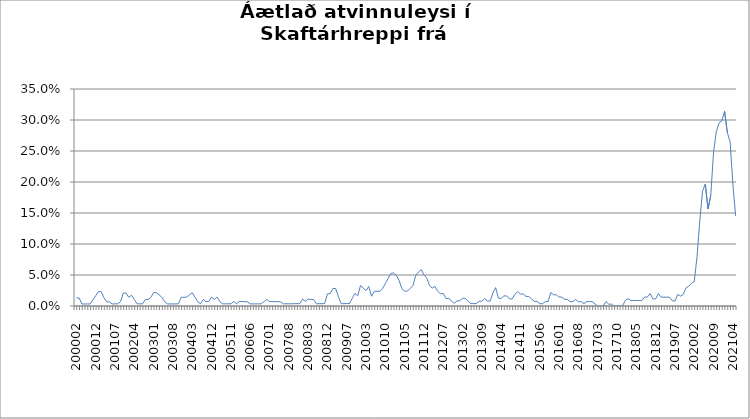
| Category | Series 0 |
|---|---|
| 200002 | 0.013 |
| 200003 | 0.013 |
| 200004 | 0.003 |
| 200005 | 0.003 |
| 200006 | 0.003 |
| 200007 | 0.003 |
| 200011 | 0.01 |
| 200012 | 0.017 |
| 200101 | 0.023 |
| 200102 | 0.023 |
| 200103 | 0.013 |
| 200104 | 0.007 |
| 200105 | 0.007 |
| 200106 | 0.003 |
| 200107 | 0.003 |
| 200108 | 0.003 |
| 200111 | 0.007 |
| 200112 | 0.021 |
| 200201 | 0.021 |
| 200202 | 0.014 |
| 200203 | 0.017 |
| 200204 | 0.01 |
| 200205 | 0.003 |
| 200206 | 0.003 |
| 200207 | 0.003 |
| 200210 | 0.01 |
| 200211 | 0.01 |
| 200212 | 0.014 |
| 200301 | 0.022 |
| 200302 | 0.022 |
| 200303 | 0.018 |
| 200304 | 0.014 |
| 200305 | 0.007 |
| 200306 | 0.003 |
| 200307 | 0.003 |
| 200308 | 0.003 |
| 200309 | 0.003 |
| 200310 | 0.004 |
| 200311 | 0.014 |
| 200312 | 0.014 |
| 200401 | 0.014 |
| 200402 | 0.018 |
| 200403 | 0.022 |
| 200404 | 0.014 |
| 200405 | 0.007 |
| 200406 | 0.004 |
| 200407 | 0.011 |
| 200408 | 0.007 |
| 200411 | 0.007 |
| 200412 | 0.014 |
| 200501 | 0.011 |
| 200502 | 0.014 |
| 200503 | 0.007 |
| 200504 | 0.004 |
| 200505 | 0.004 |
| 200510 | 0.004 |
| 200511 | 0.004 |
| 200512 | 0.007 |
| 200601 | 0.004 |
| 200602 | 0.007 |
| 200603 | 0.007 |
| 200604 | 0.007 |
| 200605 | 0.007 |
| 200606 | 0.003 |
| 200607 | 0.003 |
| 200608 | 0.003 |
| 200609 | 0.003 |
| 200610 | 0.004 |
| 200611 | 0.007 |
| 200612 | 0.011 |
| 200701 | 0.007 |
| 200702 | 0.007 |
| 200703 | 0.007 |
| 200704 | 0.007 |
| 200705 | 0.007 |
| 200706 | 0.003 |
| 200707 | 0.004 |
| 200708 | 0.004 |
| 200709 | 0.004 |
| 200710 | 0.004 |
| 200711 | 0.004 |
| 200712 | 0.004 |
| 200801 | 0.011 |
| 200802 | 0.007 |
| 200803 | 0.011 |
| 200804 | 0.011 |
| 200805 | 0.011 |
| 200806 | 0.004 |
| 200807 | 0.004 |
| 200808 | 0.004 |
| 200811 | 0.004 |
| 200812 | 0.019 |
| 200901 | 0.02 |
| 200902 | 0.028 |
| 200903 | 0.028 |
| 200904 | 0.015 |
| 200905 | 0.004 |
| 200906 | 0.004 |
| 200907 | 0.004 |
| 200908 | 0.004 |
| 200910 | 0.012 |
| 200911 | 0.02 |
| 200912 | 0.016 |
| 201001 | 0.033 |
| 201002 | 0.029 |
| 201003 | 0.025 |
| 201004 | 0.031 |
| 201005 | 0.016 |
| 201006 | 0.024 |
| 201007 | 0.024 |
| 201008 | 0.024 |
| 201009 | 0.028 |
| 201010 | 0.036 |
| 201011 | 0.044 |
| 201012 | 0.052 |
| 201101 | 0.053 |
| 201102 | 0.049 |
| 201103 | 0.041 |
| 201104 | 0.028 |
| 201105 | 0.024 |
| 201106 | 0.024 |
| 201107 | 0.028 |
| 201108 | 0.033 |
| 201109 | 0.049 |
| 201110 | 0.055 |
| 201111 | 0.059 |
| 201112 | 0.05 |
| 201201 | 0.045 |
| 201202 | 0.033 |
| 201203 | 0.029 |
| 201204 | 0.032 |
| 201205 | 0.024 |
| 201206 | 0.02 |
| 201207 | 0.02 |
| 201208 | 0.012 |
| 201209 | 0.012 |
| 201210 | 0.008 |
| 201211 | 0.004 |
| 201212 | 0.008 |
| 201301 | 0.008 |
| 201302 | 0.012 |
| 201303 | 0.012 |
| 201304 | 0.008 |
| 201305 | 0.004 |
| 201306 | 0.004 |
| 201307 | 0.004 |
| 201308 | 0.008 |
| 201309 | 0.008 |
| 201310 | 0.012 |
| 201311 | 0.008 |
| 201312 | 0.008 |
| 201401 | 0.021 |
| 201402 | 0.03 |
| 201403 | 0.013 |
| 201404 | 0.012 |
| 201405 | 0.016 |
| 201406 | 0.016 |
| 201407 | 0.011 |
| 201408 | 0.011 |
| 201409 | 0.019 |
| 201410 | 0.023 |
| 201411 | 0.019 |
| 201412 | 0.019 |
| 201501 | 0.015 |
| 201502 | 0.015 |
| 201503 | 0.012 |
| 201504 | 0.008 |
| 201505 | 0.008 |
| 201506 | 0.004 |
| 201507 | 0.004 |
| 201508 | 0.007 |
| 201509 | 0.007 |
| 201510 | 0.022 |
| 201511 | 0.018 |
| 201512 | 0.018 |
| 201601 | 0.014 |
| 201602 | 0.014 |
| 201603 | 0.011 |
| 201604 | 0.011 |
| 201605 | 0.007 |
| 201606 | 0.007 |
| 201607 | 0.011 |
| 201608 | 0.007 |
| 201609 | 0.007 |
| 201610 | 0.004 |
| 201611 | 0.007 |
| 201612 | 0.007 |
| 201701 | 0.007 |
| 201702 | 0.004 |
| 201703 | 0 |
| 201704 | 0 |
| 201705 | 0 |
| 201706 | 0.007 |
| 201707 | 0.003 |
| 201708 | 0.003 |
| 201709 | 0 |
| 201710 | 0 |
| 201711 | 0 |
| 201712 | 0 |
| 201801 | 0.009 |
| 201802 | 0.012 |
| 201803 | 0.009 |
| 201804 | 0.009 |
| 201805 | 0.009 |
| 201806 | 0.009 |
| 201807 | 0.009 |
| 201808 | 0.014 |
| 201809 | 0.014 |
| 201810 | 0.02 |
| 201811 | 0.011 |
| 201812 | 0.011 |
| 201901 | 0.02 |
| 201902 | 0.014 |
| 201903 | 0.014 |
| 201904 | 0.014 |
| 201905 | 0.014 |
| 201906 | 0.009 |
| 201907 | 0.008 |
| 201908 | 0.019 |
| 201909 | 0.016 |
| 201910 | 0.019 |
| 201911 | 0.029 |
| 201912 | 0.032 |
| 202001 | 0.037 |
| 202002 | 0.039 |
| 202003 | 0.079 |
| 202004 | 0.137 |
| 202005 | 0.185 |
| 202006 | 0.197 |
| 202007 | 0.156 |
| 202008 | 0.179 |
| 202009 | 0.249 |
| 202010 | 0.281 |
| 202011 | 0.296 |
| 202012 | 0.299 |
| 202101 | 0.314 |
| 202102 | 0.28 |
| 202103 | 0.265 |
| 202104 | 0.197 |
| 202105 | 0.145 |